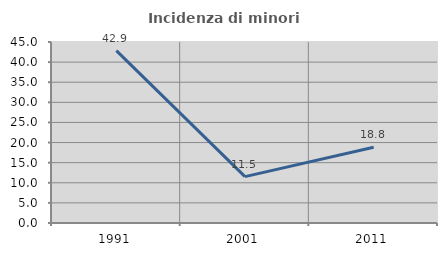
| Category | Incidenza di minori stranieri |
|---|---|
| 1991.0 | 42.857 |
| 2001.0 | 11.538 |
| 2011.0 | 18.812 |